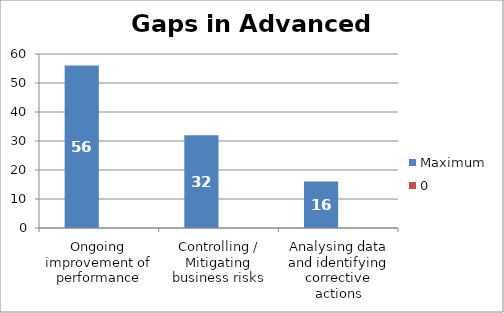
| Category | Maximum | 0 |
|---|---|---|
| Ongoing improvement of performance | 56 | 0 |
| Controlling / Mitigating business risks | 32 | 0 |
| Analysing data and identifying corrective actions | 16 | 0 |